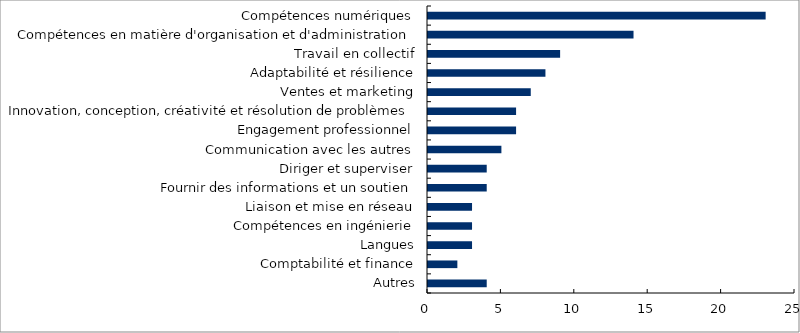
| Category | Series 0 |
|---|---|
| Autres | 4 |
| Comptabilité et finance | 2 |
| Langues | 3 |
| Compétences en ingénierie | 3 |
| Liaison et mise en réseau | 3 |
| Fournir des informations et un soutien | 4 |
| Diriger et superviser | 4 |
| Communication avec les autres | 5 |
| Engagement professionnel | 6 |
| Innovation, conception, créativité et résolution de problèmes | 6 |
| Ventes et marketing | 7 |
| Adaptabilité et résilience | 8 |
| Travail en collectif | 9 |
| Compétences en matière d'organisation et d'administration | 14 |
| Compétences numériques | 23 |